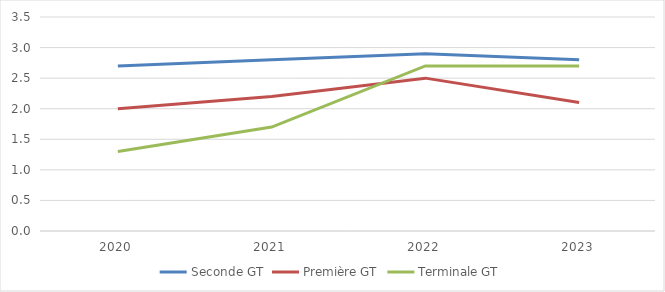
| Category | Seconde GT | Première GT | Terminale GT |
|---|---|---|---|
| 2020.0 | 2.7 | 2 | 1.3 |
| 2021.0 | 2.8 | 2.2 | 1.7 |
| 2022.0 | 2.9 | 2.5 | 2.7 |
| 2023.0 | 2.8 | 2.1 | 2.7 |